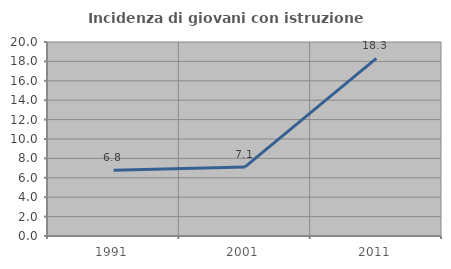
| Category | Incidenza di giovani con istruzione universitaria |
|---|---|
| 1991.0 | 6.791 |
| 2001.0 | 7.124 |
| 2011.0 | 18.302 |